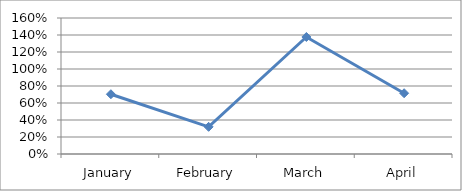
| Category | PERCENTAGE |
|---|---|
| January | 0.703 |
| February | 0.32 |
| March | 1.377 |
| April | 0.715 |